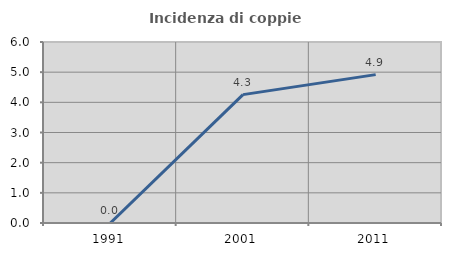
| Category | Incidenza di coppie miste |
|---|---|
| 1991.0 | 0 |
| 2001.0 | 4.255 |
| 2011.0 | 4.918 |